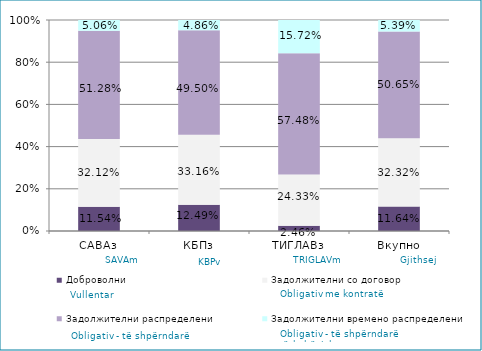
| Category | Доброволни  | Задолжителни со договор  | Задолжителни распределени  | Задолжителни времено распределени  |
|---|---|---|---|---|
| САВАз | 0.115 | 0.321 | 0.513 | 0.051 |
| КБПз | 0.125 | 0.332 | 0.495 | 0.049 |
| ТИГЛАВз | 0.025 | 0.243 | 0.575 | 0.157 |
| Вкупно | 0.116 | 0.323 | 0.506 | 0.054 |